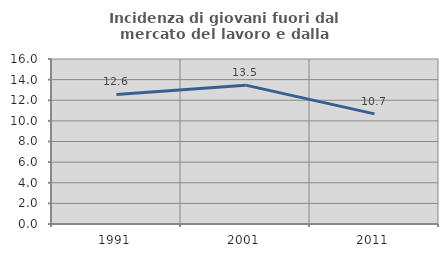
| Category | Incidenza di giovani fuori dal mercato del lavoro e dalla formazione  |
|---|---|
| 1991.0 | 12.558 |
| 2001.0 | 13.465 |
| 2011.0 | 10.68 |